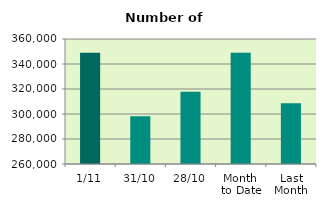
| Category | Series 0 |
|---|---|
| 1/11 | 348902 |
| 31/10 | 298140 |
| 28/10 | 317784 |
| Month 
to Date | 348902 |
| Last
Month | 308508.19 |